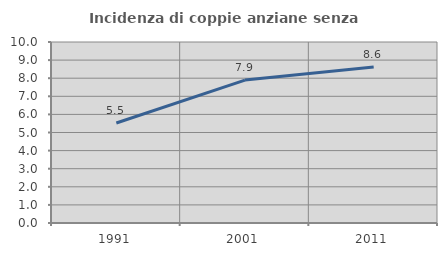
| Category | Incidenza di coppie anziane senza figli  |
|---|---|
| 1991.0 | 5.526 |
| 2001.0 | 7.895 |
| 2011.0 | 8.617 |